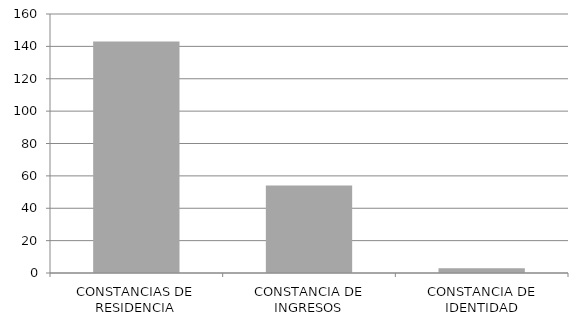
| Category | Series 0 |
|---|---|
| CONSTANCIAS DE RESIDENCIA | 143 |
| CONSTANCIA DE INGRESOS | 54 |
| CONSTANCIA DE IDENTIDAD | 3 |